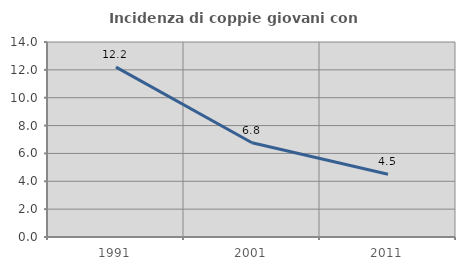
| Category | Incidenza di coppie giovani con figli |
|---|---|
| 1991.0 | 12.195 |
| 2001.0 | 6.767 |
| 2011.0 | 4.505 |